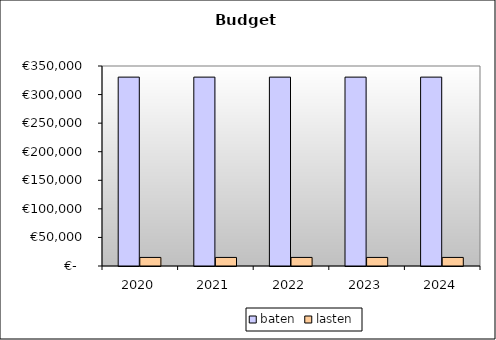
| Category | baten | lasten |
|---|---|---|
| 2020.0 | 330558.15 | 15000 |
| 2021.0 | 330558.15 | 15000 |
| 2022.0 | 330558.15 | 15000 |
| 2023.0 | 330558.15 | 15000 |
| 2024.0 | 330558.15 | 15000 |